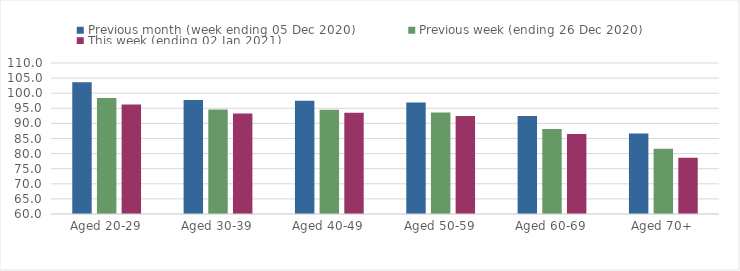
| Category | Previous month (week ending 05 Dec 2020) | Previous week (ending 26 Dec 2020) | This week (ending 02 Jan 2021) |
|---|---|---|---|
| Aged 20-29 | 103.66 | 98.42 | 96.23 |
| Aged 30-39 | 97.71 | 94.61 | 93.31 |
| Aged 40-49 | 97.48 | 94.54 | 93.53 |
| Aged 50-59 | 96.96 | 93.57 | 92.45 |
| Aged 60-69 | 92.49 | 88.16 | 86.53 |
| Aged 70+ | 86.69 | 81.57 | 78.65 |